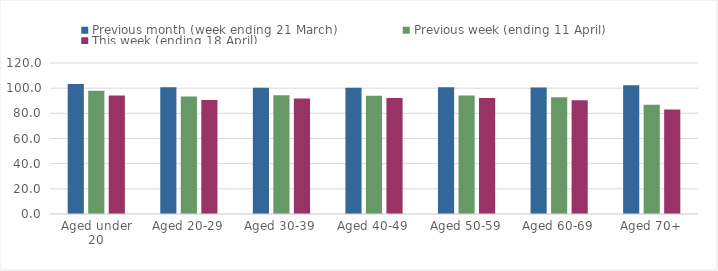
| Category | Previous month (week ending 21 March) | Previous week (ending 11 April) | This week (ending 18 April) |
|---|---|---|---|
| Aged under 20 | 103.307 | 97.904 | 94.096 |
| Aged 20-29 | 100.824 | 93.354 | 90.517 |
| Aged 30-39 | 100.38 | 94.328 | 91.783 |
| Aged 40-49 | 100.296 | 94.003 | 92.247 |
| Aged 50-59 | 100.739 | 94.213 | 92.184 |
| Aged 60-69 | 100.602 | 92.811 | 90.46 |
| Aged 70+ | 102.271 | 86.875 | 83.136 |